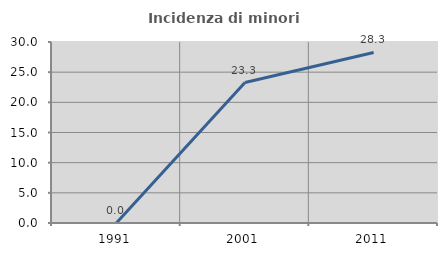
| Category | Incidenza di minori stranieri |
|---|---|
| 1991.0 | 0 |
| 2001.0 | 23.28 |
| 2011.0 | 28.261 |